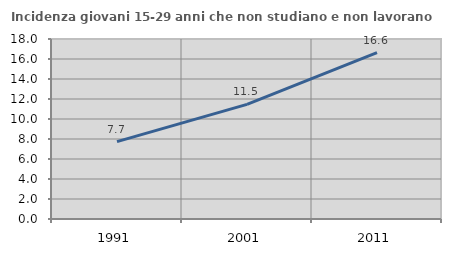
| Category | Incidenza giovani 15-29 anni che non studiano e non lavorano  |
|---|---|
| 1991.0 | 7.735 |
| 2001.0 | 11.462 |
| 2011.0 | 16.634 |